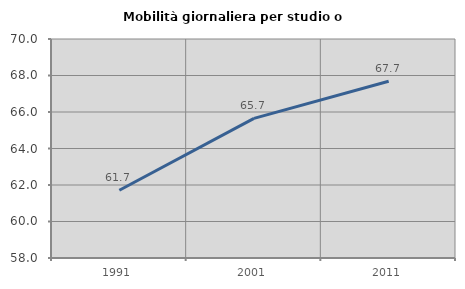
| Category | Mobilità giornaliera per studio o lavoro |
|---|---|
| 1991.0 | 61.71 |
| 2001.0 | 65.653 |
| 2011.0 | 67.685 |